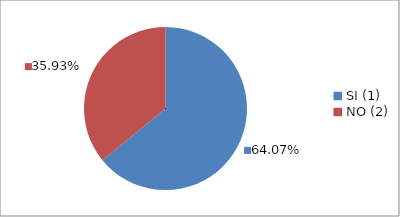
| Category | Series 0 |
|---|---|
| SI (1) | 0.641 |
| NO (2) | 0.359 |